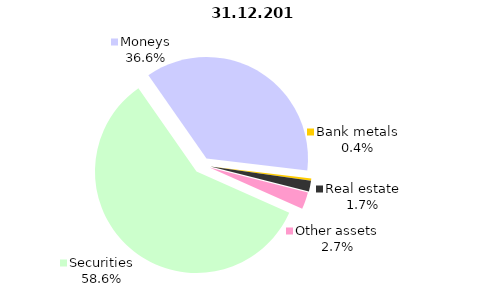
| Category | 31.12.2018 |
|---|---|
| Securities | 1609.6 |
| Moneys | 1004 |
| Bank metals | 9.8 |
| Real estate | 47.3 |
| Other assets | 74.5 |